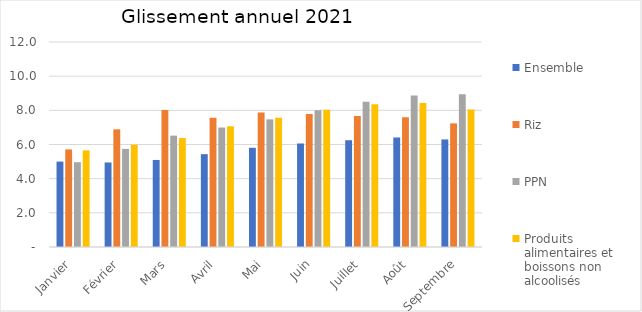
| Category |  Ensemble  |  Riz  |  PPN  |  Produits alimentaires et boissons non alcoolisés  |
|---|---|---|---|---|
| Janvier | 5 | 5.712 | 4.963 | 5.657 |
| Février | 4.948 | 6.888 | 5.742 | 5.988 |
| Mars | 5.096 | 8.018 | 6.52 | 6.379 |
| Avril | 5.435 | 7.561 | 6.994 | 7.067 |
| Mai | 5.806 | 7.876 | 7.471 | 7.573 |
| Juin | 6.06 | 7.789 | 8.002 | 8.041 |
| Juillet | 6.251 | 7.667 | 8.499 | 8.356 |
| Août | 6.411 | 7.597 | 8.863 | 8.428 |
| Septembre | 6.297 | 7.236 | 8.939 | 8.042 |